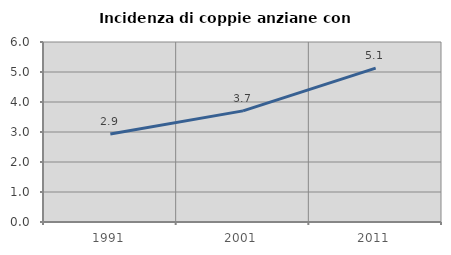
| Category | Incidenza di coppie anziane con figli |
|---|---|
| 1991.0 | 2.935 |
| 2001.0 | 3.704 |
| 2011.0 | 5.128 |